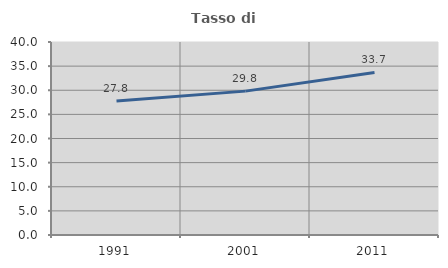
| Category | Tasso di occupazione   |
|---|---|
| 1991.0 | 27.778 |
| 2001.0 | 29.819 |
| 2011.0 | 33.684 |